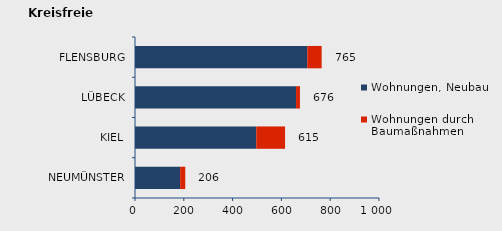
| Category | Wohnungen, Neubau | Wohnungen durch Baumaßnahmen | Series 2 |
|---|---|---|---|
| NEUMÜNSTER | 185 | 21 | 206 |
| KIEL | 497 | 118 | 615 |
| LÜBECK | 660 | 16 | 676 |
| FLENSBURG | 706 | 59 | 765 |